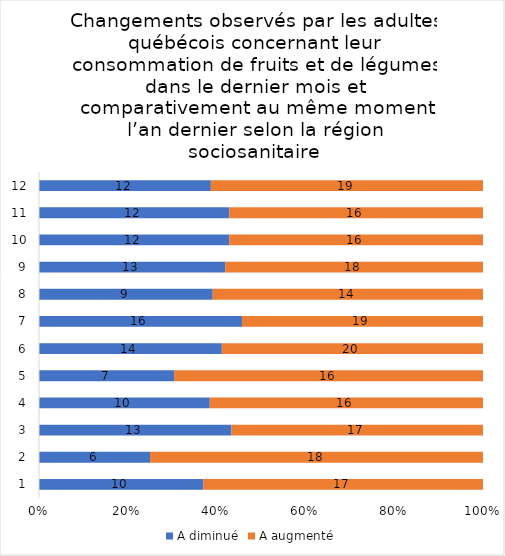
| Category | A diminué | A augmenté |
|---|---|---|
| 0 | 10 | 17 |
| 1 | 6 | 18 |
| 2 | 13 | 17 |
| 3 | 10 | 16 |
| 4 | 7 | 16 |
| 5 | 14 | 20 |
| 6 | 16 | 19 |
| 7 | 9 | 14 |
| 8 | 13 | 18 |
| 9 | 12 | 16 |
| 10 | 12 | 16 |
| 11 | 12 | 19 |